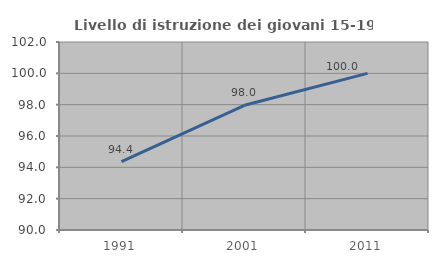
| Category | Livello di istruzione dei giovani 15-19 anni |
|---|---|
| 1991.0 | 94.366 |
| 2001.0 | 97.959 |
| 2011.0 | 100 |